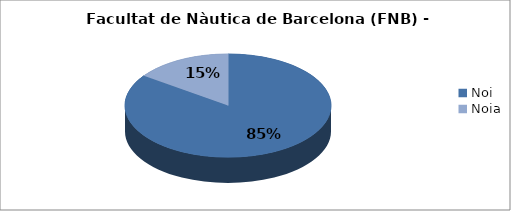
| Category | Facultat de Nàutica de Barcelona (FNB) - Gènere |
|---|---|
| Noi | 0.848 |
| Noia | 0.152 |